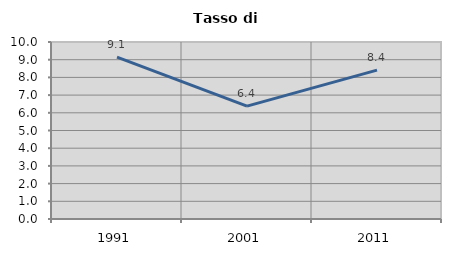
| Category | Tasso di disoccupazione   |
|---|---|
| 1991.0 | 9.147 |
| 2001.0 | 6.375 |
| 2011.0 | 8.414 |